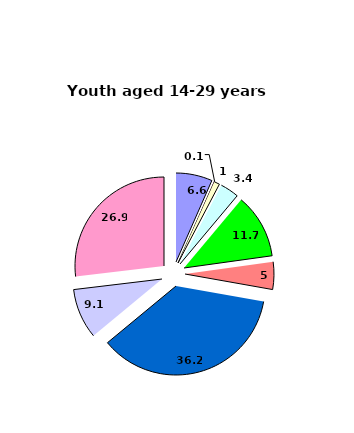
| Category | Series 0 |
|---|---|
| some infectious and parasitic diseases | 6.6 |
|  neoplasms | 0.1 |
|  endocrin system diseases, malnutrition, metabolism  | 1 |
| 
 blood and hematogenic organs diseases  | 3.4 |
| diseases of  the nervous  system and organse of sense | 11.7 |
| diseases of the circulatory system | 5 |
|  diseases of the respiratory system  | 36.2 |
|  diseases of the digestive system  | 9.1 |
|  other | 26.9 |